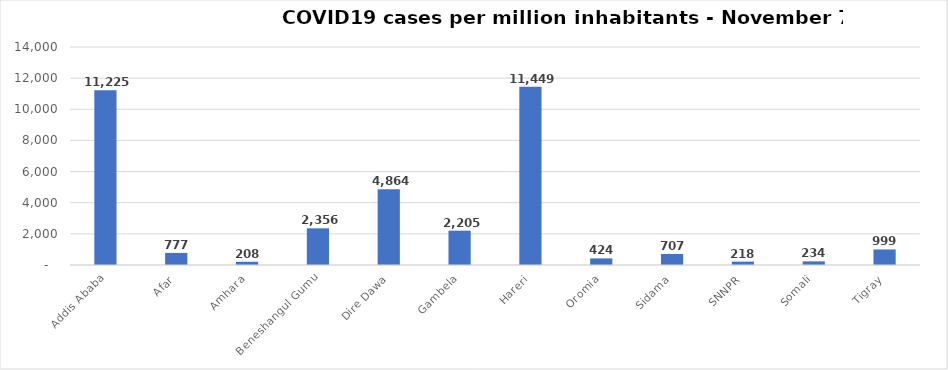
| Category | Case per million |
|---|---|
| Addis Ababa | 11224.948 |
| Afar | 777.246 |
| Amhara | 208.171 |
| Beneshangul Gumu | 2356.364 |
| Dire Dawa | 4864.307 |
| Gambela | 2205.22 |
| Hareri | 11448.541 |
| Oromia | 423.764 |
| Sidama | 706.615 |
| SNNPR | 217.762 |
| Somali | 234.457 |
| Tigray | 999.009 |